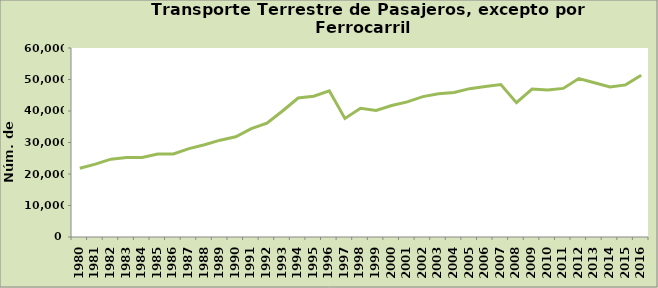
| Category | Series 0 |
|---|---|
| 1980.0 | 21840 |
| 1981.0 | 23120 |
| 1982.0 | 24701 |
| 1983.0 | 25225 |
| 1984.0 | 25268 |
| 1985.0 | 26316 |
| 1986.0 | 26382 |
| 1987.0 | 28073 |
| 1988.0 | 29279 |
| 1989.0 | 30735 |
| 1990.0 | 31811 |
| 1991.0 | 34380 |
| 1992.0 | 36140 |
| 1993.0 | 39997 |
| 1994.0 | 44109 |
| 1995.0 | 44711 |
| 1996.0 | 46427 |
| 1997.0 | 37643 |
| 1998.0 | 40846 |
| 1999.0 | 40197 |
| 2000.0 | 41758 |
| 2001.0 | 42899 |
| 2002.0 | 44573 |
| 2003.0 | 45485 |
| 2004.0 | 45906 |
| 2005.0 | 47092 |
| 2006.0 | 47751 |
| 2007.0 | 48374 |
| 2008.0 | 42648 |
| 2009.0 | 46948 |
| 2010.0 | 46658 |
| 2011.0 | 47172 |
| 2012.0 | 50312 |
| 2013.0 | 48981 |
| 2014.0 | 47610 |
| 2015.0 | 48287 |
| 2016.0 | 51371 |